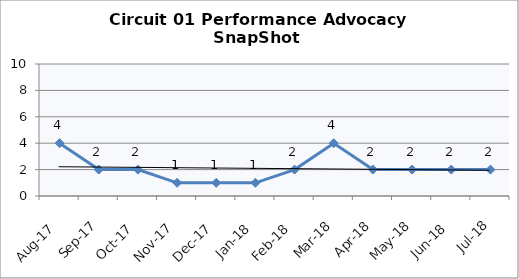
| Category | Circuit 01 |
|---|---|
| Aug-17 | 4 |
| Sep-17 | 2 |
| Oct-17 | 2 |
| Nov-17 | 1 |
| Dec-17 | 1 |
| Jan-18 | 1 |
| Feb-18 | 2 |
| Mar-18 | 4 |
| Apr-18 | 2 |
| May-18 | 2 |
| Jun-18 | 2 |
| Jul-18 | 2 |